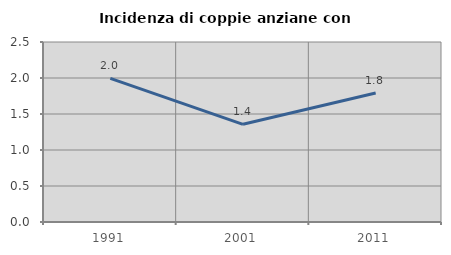
| Category | Incidenza di coppie anziane con figli |
|---|---|
| 1991.0 | 1.996 |
| 2001.0 | 1.357 |
| 2011.0 | 1.793 |